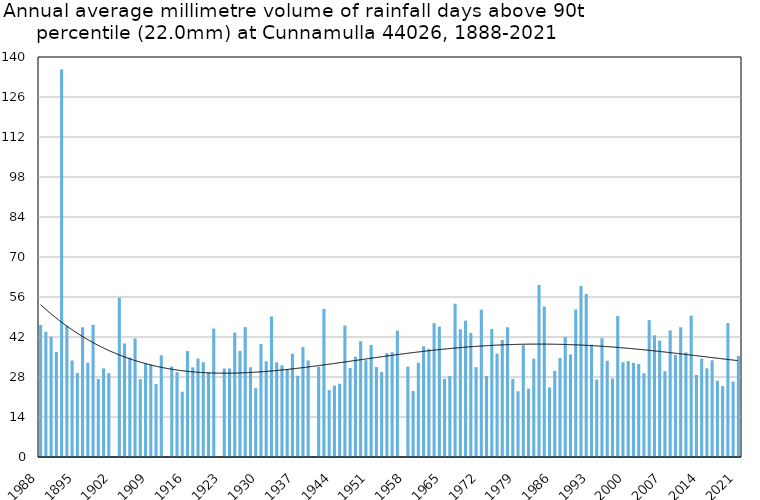
| Category | Annual average mm in days above 90th percentile |
|---|---|
| 1988 | 46.233 |
| 1889 | 43.833 |
| 1890 | 42.089 |
| 1891 | 36.74 |
| 1892 | 135.6 |
| 1893 | 45.95 |
| 1894 | 33.8 |
| 1895 | 29.383 |
| 1896 | 45.4 |
| 1897 | 32.975 |
| 1898 | 46.25 |
| 1899 | 27.3 |
| 1900 | 31 |
| 1901 | 29.325 |
| 1902 | 0 |
| 1903 | 55.767 |
| 1904 | 39.733 |
| 1905 | 34.8 |
| 1906 | 41.5 |
| 1907 | 27.2 |
| 1908 | 32.76 |
| 1909 | 32.4 |
| 1910 | 25.54 |
| 1911 | 35.567 |
| 1912 | 0 |
| 1913 | 31.66 |
| 1914 | 29.683 |
| 1915 | 22.85 |
| 1916 | 37.08 |
| 1917 | 31.4 |
| 1918 | 34.475 |
| 1919 | 33.15 |
| 1920 | 29.57 |
| 1921 | 44.967 |
| 1922 | 0 |
| 1923 | 31 |
| 1924 | 31 |
| 1925 | 43.58 |
| 1926 | 37.117 |
| 1927 | 45.45 |
| 1928 | 31.425 |
| 1929 | 24.1 |
| 1930 | 39.583 |
| 1931 | 33.471 |
| 1932 | 49.15 |
| 1933 | 33.14 |
| 1934 | 32.1 |
| 1935 | 30.75 |
| 1936 | 36.12 |
| 1937 | 28.433 |
| 1938 | 38.5 |
| 1939 | 33.817 |
| 1940 | 0 |
| 1941 | 31.543 |
| 1942 | 51.838 |
| 1943 | 23.4 |
| 1944 | 25 |
| 1945 | 25.65 |
| 1946 | 46 |
| 1947 | 31.129 |
| 1948 | 35.1 |
| 1949 | 40.527 |
| 1950 | 33.9 |
| 1951 | 39.25 |
| 1952 | 31.5 |
| 1953 | 29.7 |
| 1954 | 36.375 |
| 1955 | 36.667 |
| 1956 | 44.214 |
| 1957 | 0 |
| 1958 | 31.65 |
| 1959 | 23.1 |
| 1960 | 32.98 |
| 1961 | 38.76 |
| 1962 | 37.86 |
| 1963 | 46.85 |
| 1964 | 45.62 |
| 1965 | 27.4 |
| 1966 | 28.3 |
| 1967 | 53.667 |
| 1968 | 44.7 |
| 1969 | 47.733 |
| 1970 | 43.44 |
| 1971 | 31.457 |
| 1972 | 51.6 |
| 1973 | 28.325 |
| 1974 | 44.817 |
| 1975 | 36.171 |
| 1976 | 40.97 |
| 1977 | 45.4 |
| 1978 | 27.3 |
| 1979 | 23 |
| 1980 | 39.15 |
| 1981 | 23.94 |
| 1982 | 34.4 |
| 1983 | 60.24 |
| 1984 | 52.68 |
| 1985 | 24.333 |
| 1986 | 30.133 |
| 1987 | 34.65 |
| 1988 | 42 |
| 1989 | 35.875 |
| 1990 | 51.6 |
| 1991 | 59.84 |
| 1992 | 57.05 |
| 1993 | 39.3 |
| 1994 | 27.1 |
| 1995 | 41.6 |
| 1996 | 33.68 |
| 1997 | 27.48 |
| 1998 | 49.35 |
| 1999 | 33.16 |
| 2000 | 33.575 |
| 2001 | 32.933 |
| 2002 | 32.55 |
| 2003 | 29.3 |
| 2004 | 47.9 |
| 2005 | 42.6 |
| 2006 | 40.733 |
| 2007 | 30.057 |
| 2008 | 44.3 |
| 2009 | 35.72 |
| 2010 | 45.4 |
| 2011 | 36.6 |
| 2012 | 49.467 |
| 2013 | 28.7 |
| 2014 | 34.44 |
| 2015 | 31.033 |
| 2016 | 33.857 |
| 2017 | 26.7 |
| 2018 | 24.8 |
| 2019 | 46.9 |
| 2020 | 26.4 |
| 2021 | 35.4 |